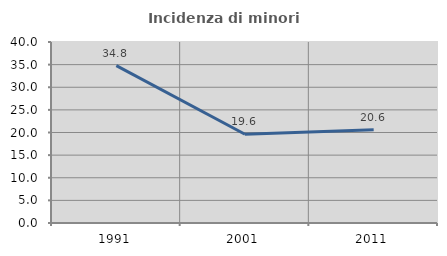
| Category | Incidenza di minori stranieri |
|---|---|
| 1991.0 | 34.783 |
| 2001.0 | 19.608 |
| 2011.0 | 20.588 |